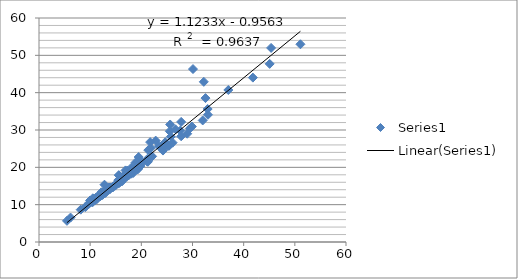
| Category | Series 0 |
|---|---|
| 21.12200783072 | 21.593 |
| 10.9921900661208 | 11.275 |
| 12.4707262690716 | 12.714 |
| 14.9206645566142 | 15.102 |
| 15.660697993657 | 17.794 |
| 12.9947359459901 | 13.142 |
| 9.30117492642039 | 9.703 |
| 22.8043150161868 | 27.155 |
| 12.7970398608071 | 15.35 |
| 15.3781869523344 | 15.636 |
| 6.16283646128447 | 6.552 |
| 17.0576945220335 | 17.64 |
| 21.1786422834401 | 22.254 |
| 23.8672255663075 | 25.621 |
| 19.3476807816813 | 20.156 |
| 25.4206625532348 | 25.793 |
| 16.994142747698 | 17.875 |
| 30.0948184498715 | 46.324 |
| 16.2456906799545 | 16.269 |
| 29.8848833769922 | 30.93 |
| 32.9625679206975 | 35.617 |
| 17.0394933659357 | 18.206 |
| 17.2499276714688 | 19.111 |
| 14.4261065226442 | 14.647 |
| 15.5533857819 | 16.067 |
| 11.714709174085 | 12.22 |
| 17.1088613384381 | 17.792 |
| 15.988015895801 | 16.483 |
| 10.9834916681671 | 11.499 |
| 12.3841391061165 | 12.604 |
| 13.5534451899837 | 14.496 |
| 31.9965689924492 | 32.555 |
| 24.2741598912481 | 25.322 |
| 13.8467452878862 | 14.193 |
| 11.133439031115 | 11.891 |
| 15.7094760225707 | 15.831 |
| 24.6734613911878 | 26.745 |
| 13.0329435100832 | 13.981 |
| 19.8175932301985 | 20.362 |
| 28.9703902479302 | 29.003 |
| 10.5238178605269 | 11.704 |
| 13.6374918519021 | 14.022 |
| 15.5969562126042 | 17.919 |
| 11.6081590161505 | 12.263 |
| 15.5165000072535 | 16.045 |
| 10.2930439967777 | 10.965 |
| 9.97567825179669 | 11.122 |
| 12.2841594837552 | 12.969 |
| 5.46401086860118 | 5.668 |
| 29.4803874947848 | 30.405 |
| 18.8744845868888 | 19.481 |
| 13.8976797547383 | 14.213 |
| 17.1515320351037 | 17.658 |
| 18.0489175588804 | 19.897 |
| 18.0532386297244 | 18.304 |
| 23.4579734197211 | 25.687 |
| 12.4555438704796 | 12.796 |
| 18.5370149967517 | 19.475 |
| 17.3026573919125 | 17.664 |
| 14.4416576116685 | 14.819 |
| 14.3589903438491 | 14.713 |
| 11.9871614342214 | 12.919 |
| 45.3607322187064 | 51.989 |
| 16.8366383704449 | 17.496 |
| 19.0453211148555 | 20.089 |
| 20.1510658621447 | 21.333 |
| 22.1109128695196 | 22.936 |
| 15.8904874517861 | 16.827 |
| 32.5393600122978 | 38.545 |
| 11.3650169203442 | 11.536 |
| 12.3253205870028 | 12.826 |
| 19.2295158336437 | 20.034 |
| 12.5536192015081 | 13.377 |
| 41.8004188783569 | 44.031 |
| 15.4939056111454 | 16.568 |
| 17.0956914670196 | 18.033 |
| 12.1478594396464 | 12.717 |
| 17.0591775997758 | 17.82 |
| 15.0732763697532 | 15.559 |
| 10.8703470043817 | 11.188 |
| 13.7490473701163 | 14.478 |
| 9.86904563917474 | 10.482 |
| 13.6296223567224 | 14.378 |
| 12.1893847927953 | 13.322 |
| 10.9779856491983 | 11.468 |
| 15.5409038028388 | 16.26 |
| 24.2321542302324 | 24.489 |
| 18.0778147241125 | 18.668 |
| 17.5048189114666 | 17.833 |
| 25.6389432184717 | 31.476 |
| 8.14756269662056 | 8.658 |
| 19.4819984145108 | 22.765 |
| 18.861457795298 | 21.271 |
| 13.3713625203294 | 13.821 |
| 16.8722520566353 | 18.054 |
| 16.906959659623 | 19.175 |
| 10.4649179949283 | 10.641 |
| 10.1090145682214 | 10.615 |
| 19.4692584238289 | 19.877 |
| 12.3509364564089 | 12.694 |
| 18.4253444527748 | 18.492 |
| 15.9331281868047 | 17.039 |
| 12.1006517932433 | 12.667 |
| 19.3049020965822 | 19.446 |
| 10.5299556987628 | 10.825 |
| 18.4055869262359 | 19.285 |
| 12.1505875127609 | 12.613 |
| 14.0198120114381 | 14.61 |
| 21.7236995078862 | 26.756 |
| 27.7855741851672 | 32.167 |
| 18.0549480727869 | 18.714 |
| 25.555866775081 | 29.666 |
| 27.7879076811325 | 28.32 |
| 25.7707315769772 | 28.216 |
| 26.1098152692981 | 26.606 |
| 26.6847688522124 | 30.183 |
| 13.6754202360795 | 14.067 |
| 37.0008727331589 | 40.718 |
| 51.0931870045502 | 52.968 |
| 17.2830187240826 | 17.931 |
| 9.74866611738704 | 10.232 |
| 33.0222740119815 | 34.075 |
| 13.814610353029 | 14.581 |
| 21.3597192294673 | 24.607 |
| 27.5983460045157 | 29.835 |
| 9.0508497505862 | 9.33 |
| 25.2712266012016 | 25.778 |
| 16.6058742437417 | 17.45 |
| 14.3608970740716 | 14.606 |
| 21.8763119690477 | 25.188 |
| 45.0845902716533 | 47.709 |
| 32.2109440271027 | 42.906 |
| 16.9896030173997 | 17.564 |
| 17.0953227739489 | 18.527 |
| 16.0243269718277 | 16.289 |
| 13.4219105637398 | 14.229 |
| 11.9879301679997 | 12.256 |
| 21.2739659275948 | 21.489 |